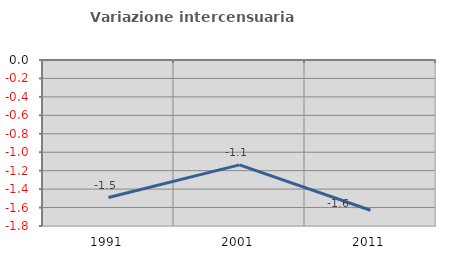
| Category | Variazione intercensuaria annua |
|---|---|
| 1991.0 | -1.492 |
| 2001.0 | -1.138 |
| 2011.0 | -1.63 |